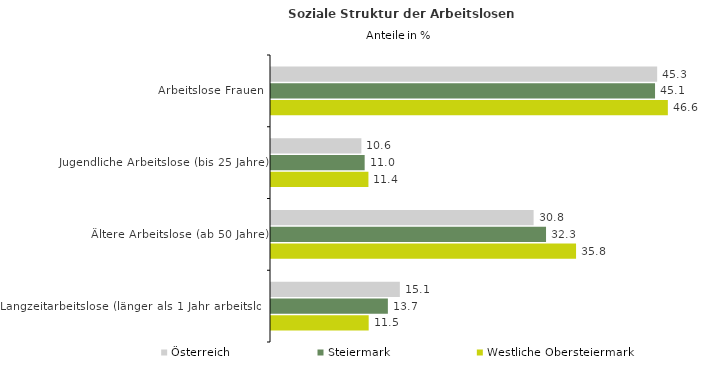
| Category | Österreich | Steiermark | Westliche Obersteiermark |
|---|---|---|---|
| Arbeitslose Frauen | 45.325 | 45.075 | 46.579 |
| Jugendliche Arbeitslose (bis 25 Jahre) | 10.608 | 10.993 | 11.435 |
| Ältere Arbeitslose (ab 50 Jahre) | 30.822 | 32.281 | 35.804 |
| Langzeitarbeitslose (länger als 1 Jahr arbeitslos) | 15.122 | 13.717 | 11.465 |